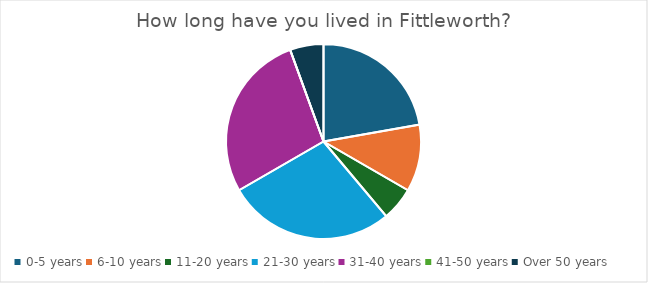
| Category | Series 0 |
|---|---|
| 0-5 years | 4 |
| 6-10 years | 2 |
| 11-20 years | 1 |
| 21-30 years | 5 |
| 31-40 years | 5 |
| 41-50 years | 0 |
| Over 50 years | 1 |